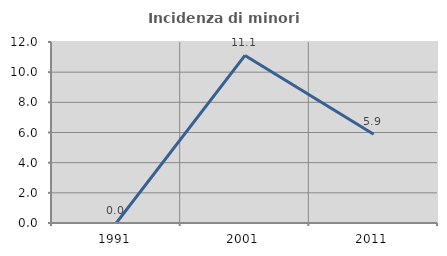
| Category | Incidenza di minori stranieri |
|---|---|
| 1991.0 | 0 |
| 2001.0 | 11.111 |
| 2011.0 | 5.882 |